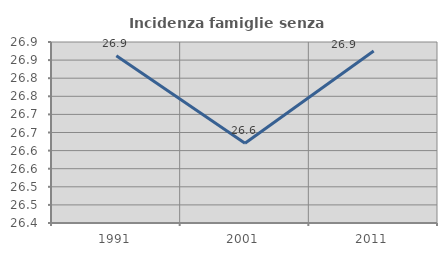
| Category | Incidenza famiglie senza nuclei |
|---|---|
| 1991.0 | 26.862 |
| 2001.0 | 26.62 |
| 2011.0 | 26.875 |